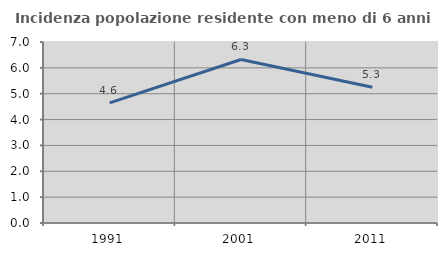
| Category | Incidenza popolazione residente con meno di 6 anni |
|---|---|
| 1991.0 | 4.648 |
| 2001.0 | 6.325 |
| 2011.0 | 5.251 |